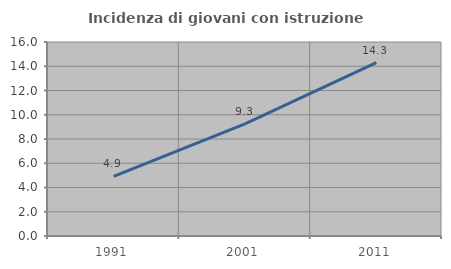
| Category | Incidenza di giovani con istruzione universitaria |
|---|---|
| 1991.0 | 4.923 |
| 2001.0 | 9.255 |
| 2011.0 | 14.3 |